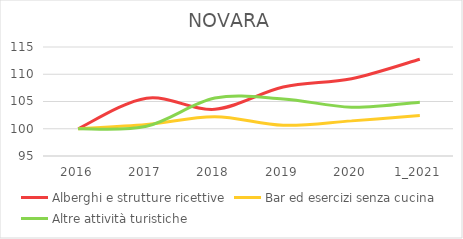
| Category | Alberghi e strutture ricettive | Bar ed esercizi senza cucina | Altre attività turistiche |
|---|---|---|---|
| 2016 | 100 | 100 | 100 |
| 2017 | 105.612 | 100.765 | 100.457 |
| 2018 | 103.571 | 102.21 | 105.632 |
| 2019 | 107.653 | 100.637 | 105.479 |
| 2020 | 109.184 | 101.445 | 103.957 |
| 1_2021 | 112.755 | 102.422 | 104.871 |